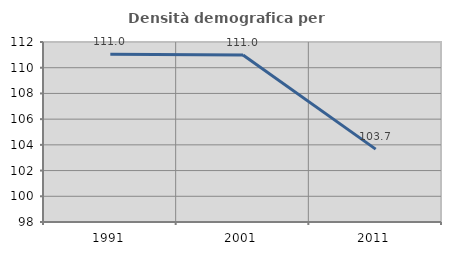
| Category | Densità demografica |
|---|---|
| 1991.0 | 111.042 |
| 2001.0 | 110.985 |
| 2011.0 | 103.666 |